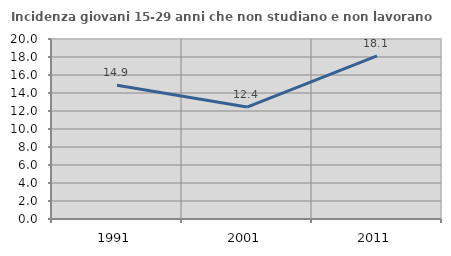
| Category | Incidenza giovani 15-29 anni che non studiano e non lavorano  |
|---|---|
| 1991.0 | 14.868 |
| 2001.0 | 12.434 |
| 2011.0 | 18.131 |